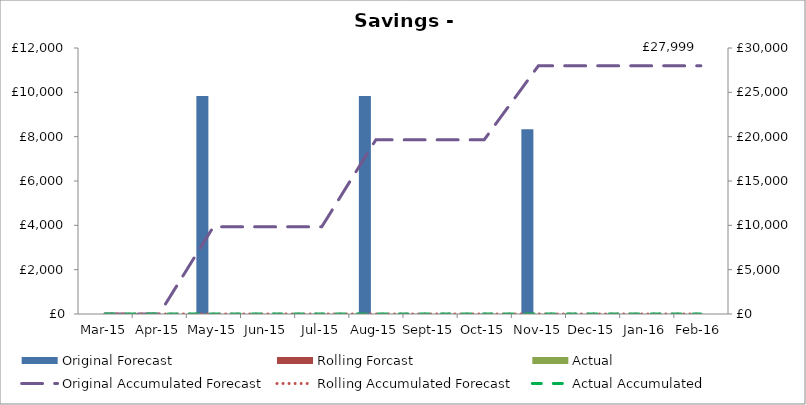
| Category | Original Forecast | Rolling Forcast | Actual |
|---|---|---|---|
| 2015-03-01 | 0 | 0 | 0 |
| 2015-04-01 | 0 | 0 | 0 |
| 2015-05-01 | 9833 | 0 | 0 |
| 2015-06-01 | 0 | 0 | 0 |
| 2015-07-01 | 0 | 0 | 0 |
| 2015-08-01 | 9833 | 0 | 0 |
| 2015-09-01 | 0 | 0 | 0 |
| 2015-10-01 | 0 | 0 | 0 |
| 2015-11-01 | 8333 | 0 | 0 |
| 2015-12-01 | 0 | 0 | 0 |
| 2016-01-01 | 0 | 0 | 0 |
| 2016-02-01 | 0 | 0 | 0 |